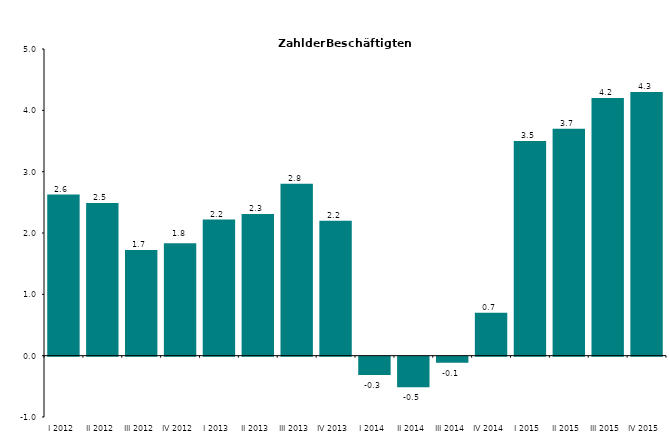
| Category | Series 0 |
|---|---|
| I 2012 | 2.627 |
| II 2012 | 2.487 |
| III 2012 | 1.724 |
| IV 2012 | 1.834 |
| I 2013 | 2.218 |
| II 2013 | 2.309 |
| III 2013 | 2.802 |
| IV 2013 | 2.2 |
| I 2014 | -0.3 |
| II 2014 | -0.5 |
| III 2014 | -0.1 |
| IV 2014 | 0.7 |
| I 2015 | 3.5 |
| II 2015 | 3.7 |
| III 2015 | 4.2 |
| IV 2015 | 4.3 |